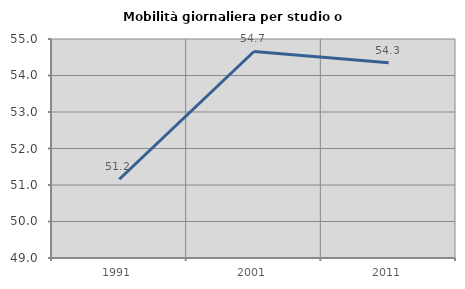
| Category | Mobilità giornaliera per studio o lavoro |
|---|---|
| 1991.0 | 51.158 |
| 2001.0 | 54.658 |
| 2011.0 | 54.348 |